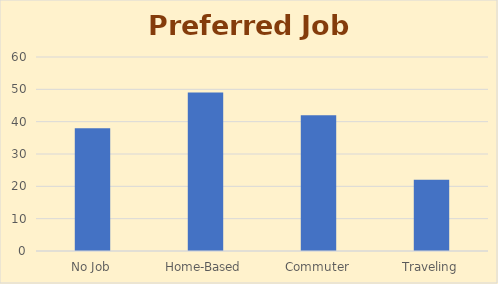
| Category | Series 0 |
|---|---|
| No Job | 38 |
| Home-Based | 49 |
| Commuter | 42 |
| Traveling | 22 |